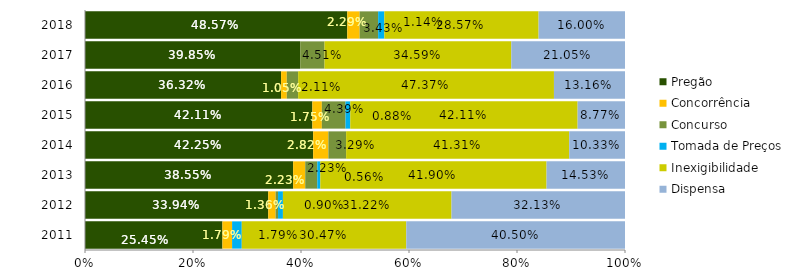
| Category | Pregão | Concorrência | Concurso | Tomada de Preços | Inexigibilidade | Dispensa |
|---|---|---|---|---|---|---|
| 2011.0 | 0.254 | 0.018 | 0 | 0.018 | 0.305 | 0.405 |
| 2012.0 | 0.339 | 0.014 | 0.005 | 0.009 | 0.312 | 0.321 |
| 2013.0 | 0.385 | 0.022 | 0.022 | 0.006 | 0.419 | 0.145 |
| 2014.0 | 0.423 | 0.028 | 0.033 | 0 | 0.413 | 0.103 |
| 2015.0 | 0.421 | 0.018 | 0.044 | 0.009 | 0.421 | 0.088 |
| 2016.0 | 0.363 | 0.011 | 0.021 | 0 | 0.474 | 0.132 |
| 2017.0 | 0.398 | 0 | 0.045 | 0 | 0.346 | 0.211 |
| 2018.0 | 0.486 | 0.023 | 0.034 | 0.011 | 0.286 | 0.16 |